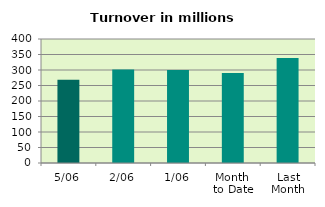
| Category | Series 0 |
|---|---|
| 5/06 | 268.745 |
| 2/06 | 301.818 |
| 1/06 | 299.926 |
| Month 
to Date | 290.163 |
| Last
Month | 338.969 |